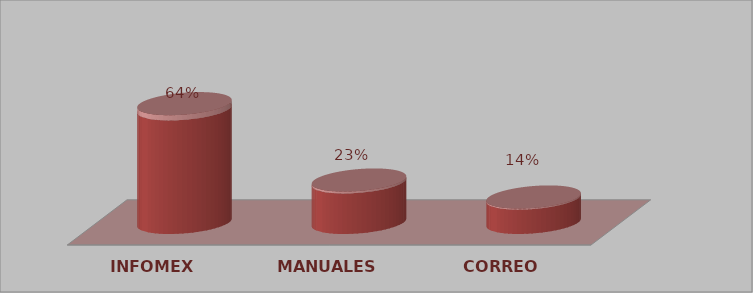
| Category | Series 0 | Series 1 |
|---|---|---|
| INFOMEX | 14 | 0.636 |
| MANUALES | 5 | 0.227 |
| CORREO | 3 | 0.136 |